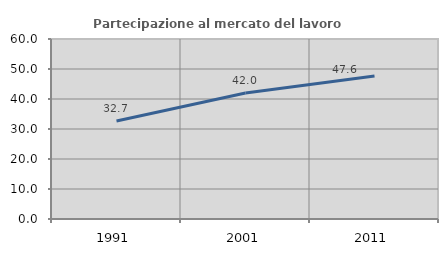
| Category | Partecipazione al mercato del lavoro  femminile |
|---|---|
| 1991.0 | 32.68 |
| 2001.0 | 41.988 |
| 2011.0 | 47.648 |